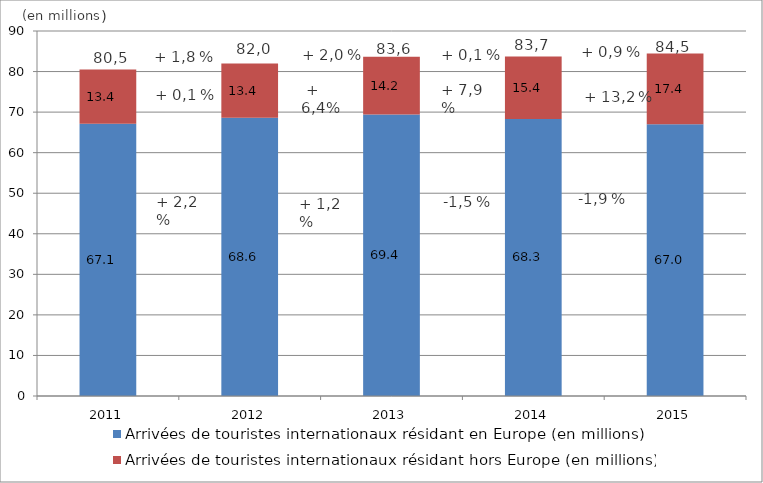
| Category | Arrivées de touristes internationaux résidant en Europe (en millions) | Arrivées de touristes internationaux résidant hors Europe (en millions) |
|---|---|---|
| 2011.0 | 67.112 | 13.386 |
| 2012.0 | 68.585 | 13.395 |
| 2013.0 | 69.388 | 14.245 |
| 2014.0 | 68.323 | 15.378 |
| 2015.0 | 67.037 | 17.414 |